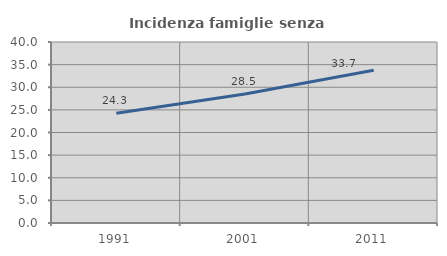
| Category | Incidenza famiglie senza nuclei |
|---|---|
| 1991.0 | 24.251 |
| 2001.0 | 28.488 |
| 2011.0 | 33.741 |